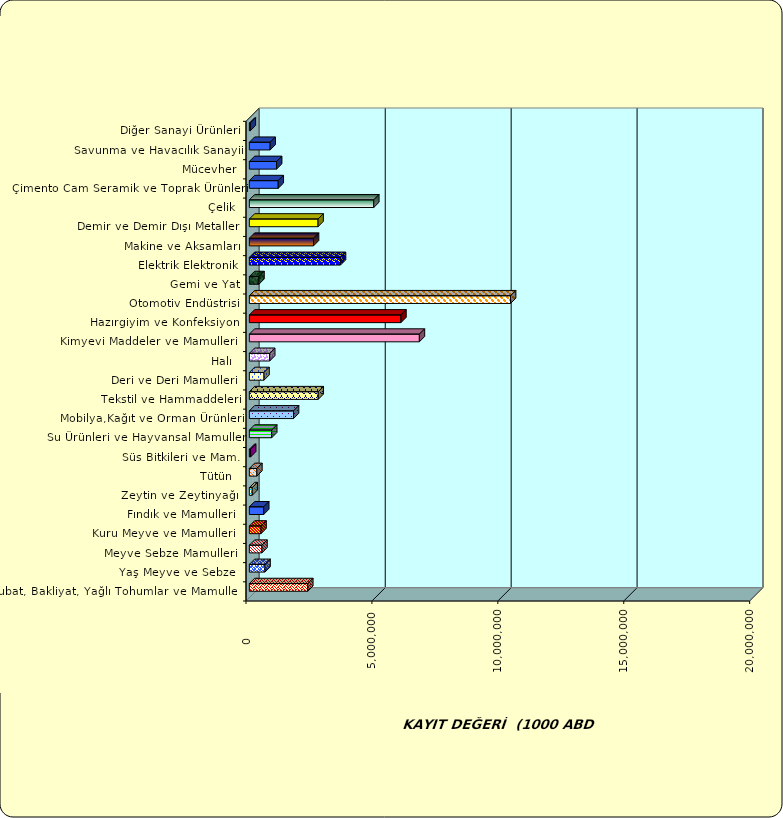
| Category | Series 0 |
|---|---|
|  Hububat, Bakliyat, Yağlı Tohumlar ve Mamulleri  | 2319802.937 |
|  Yaş Meyve ve Sebze   | 622556.086 |
|  Meyve Sebze Mamulleri  | 501540.371 |
|  Kuru Meyve ve Mamulleri   | 463722.315 |
|  Fındık ve Mamulleri  | 570178.085 |
|  Zeytin ve Zeytinyağı  | 114896.663 |
|  Tütün  | 298567.379 |
|  Süs Bitkileri ve Mam. | 51042.763 |
|  Su Ürünleri ve Hayvansal Mamuller | 887521.994 |
|  Mobilya,Kağıt ve Orman Ürünleri | 1753886.512 |
|  Tekstil ve Hammaddeleri | 2735080.793 |
|  Deri ve Deri Mamulleri  | 581786.79 |
|  Halı  | 807598.157 |
|  Kimyevi Maddeler ve Mamulleri   | 6751626.676 |
|  Hazırgiyim ve Konfeksiyon  | 6018508.245 |
|  Otomotiv Endüstrisi | 10372738.835 |
|  Gemi ve Yat | 381675.985 |
|  Elektrik Elektronik | 3618937.975 |
|  Makine ve Aksamları | 2548377.495 |
|  Demir ve Demir Dışı Metaller  | 2728359.78 |
|  Çelik | 4940943.994 |
|  Çimento Cam Seramik ve Toprak Ürünleri | 1146872.188 |
|  Mücevher | 1082360.272 |
|  Savunma ve Havacılık Sanayii | 826470.733 |
|  Diğer Sanayi Ürünleri | 38613.717 |